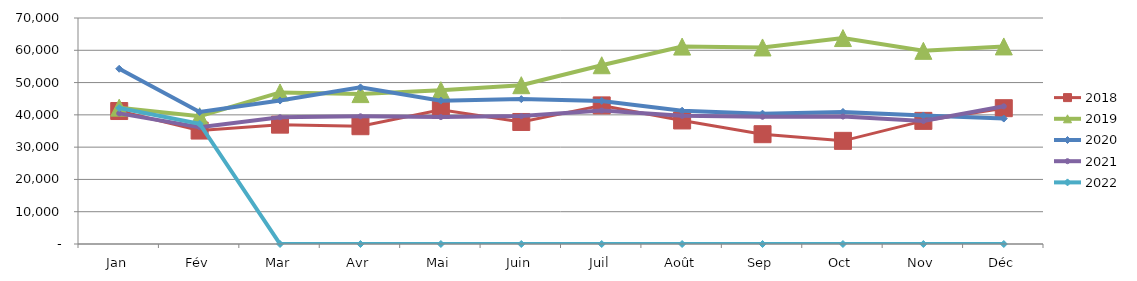
| Category | 2018 | 2019 | 2020 | 2021 | 2022 |
|---|---|---|---|---|---|
| Jan | 41189.736 | 42238.432 | 54273.068 | 40458.51 | 42125.233 |
| Fév | 35137.047 | 39568.195 | 40883.319 | 36200.926 | 37242.7 |
| Mar | 36966.816 | 46942.202 | 44426.392 | 39262.158 | 0 |
| Avr | 36485.223 | 46427.766 | 48509.843 | 39555.16 | 0 |
| Mai | 41558.724 | 47634.031 | 44407.424 | 39315.181 | 0 |
| Juin | 37797.134 | 49186.221 | 44874.513 | 39615.13 | 0 |
| Juil | 42927.847 | 55367.883 | 44316.236 | 41338.163 | 0 |
| Août | 38263.165 | 61146.365 | 41285.559 | 39690.432 | 0 |
| Sep | 34011.672 | 60874.85 | 40379.909 | 39412.556 | 0 |
| Oct | 31946.792 | 63789.634 | 40903.528 | 39474.624 | 0 |
| Nov | 38139.513 | 59829.208 | 39772.437 | 38089.775 | 0 |
| Déc | 42064.579 | 61190.831 | 38851.183 | 42639.837 | 0 |